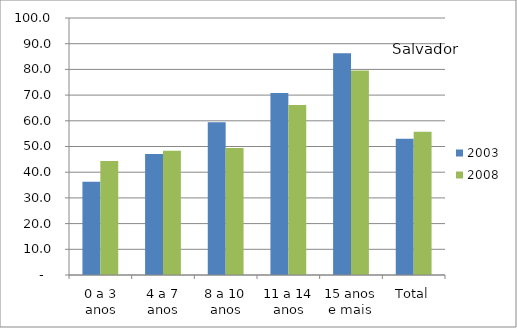
| Category | 2003 | 2008 |
|---|---|---|
| 0 a 3 anos | 36.28 | 44.33 |
| 4 a 7 anos | 47.06 | 48.35 |
| 8 a 10 anos | 59.46 | 49.41 |
| 11 a 14 anos | 70.79 | 66.15 |
| 15 anos e mais | 86.3 | 79.53 |
| Total | 53.05 | 55.72 |